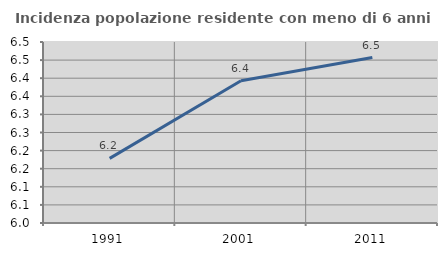
| Category | Incidenza popolazione residente con meno di 6 anni |
|---|---|
| 1991.0 | 6.179 |
| 2001.0 | 6.393 |
| 2011.0 | 6.457 |